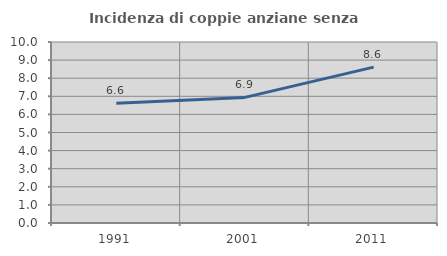
| Category | Incidenza di coppie anziane senza figli  |
|---|---|
| 1991.0 | 6.618 |
| 2001.0 | 6.939 |
| 2011.0 | 8.612 |